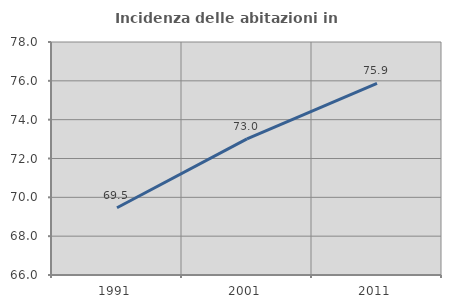
| Category | Incidenza delle abitazioni in proprietà  |
|---|---|
| 1991.0 | 69.461 |
| 2001.0 | 73.008 |
| 2011.0 | 75.868 |